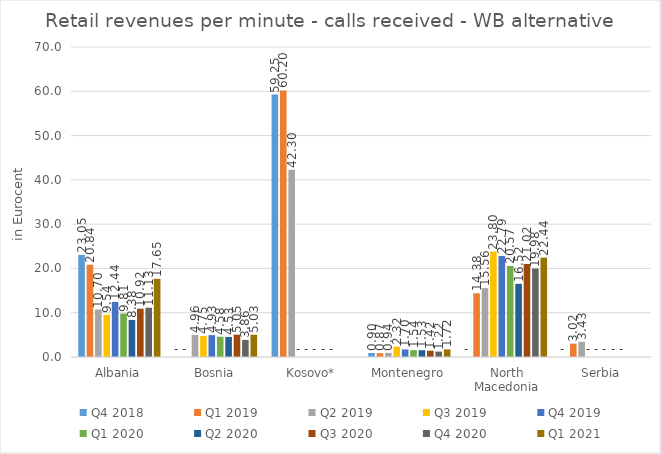
| Category | Q4 2018 | Q1 2019 | Q2 2019 | Q3 2019 | Q4 2019 | Q1 2020 | Q2 2020 | Q3 2020 | Q4 2020 | Q1 2021 |
|---|---|---|---|---|---|---|---|---|---|---|
| Albania | 23.046 | 20.84 | 10.699 | 9.545 | 12.436 | 9.809 | 8.378 | 10.916 | 11.128 | 17.654 |
| Bosnia | 0 | 0 | 4.964 | 4.748 | 4.935 | 4.575 | 4.527 | 5.047 | 3.86 | 5.031 |
| Kosovo* | 59.248 | 60.199 | 42.304 | 0 | 0 | 0 | 0 | 0 | 0 | 0 |
| Montenegro | 0.903 | 0.873 | 0.936 | 2.317 | 1.705 | 1.536 | 1.535 | 1.418 | 1.216 | 1.718 |
| North Macedonia | 0 | 14.385 | 15.556 | 23.804 | 22.792 | 20.566 | 16.523 | 21.018 | 19.983 | 22.443 |
| Serbia | 0 | 3.018 | 3.434 | 0 | 0 | 0 | 0 | 0 | 0 | 0 |